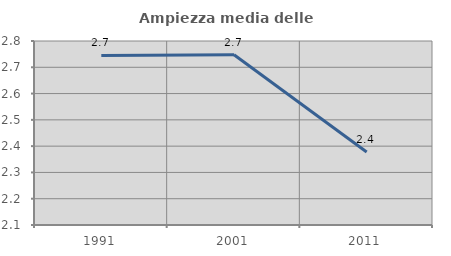
| Category | Ampiezza media delle famiglie |
|---|---|
| 1991.0 | 2.745 |
| 2001.0 | 2.748 |
| 2011.0 | 2.377 |